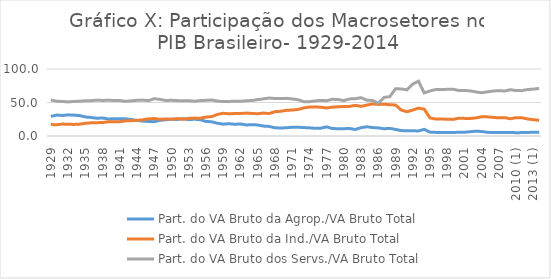
| Category | Part. do VA Bruto da Agrop./VA Bruto Total | Part. do VA Bruto da Ind./VA Bruto Total | Part. do VA Bruto dos Servs./VA Bruto Total |
|---|---|---|---|
| 1929 | 29.22 | 17.047 | 53.733 |
| 1930 | 31.262 | 16.815 | 51.923 |
| 1931 | 30.63 | 17.793 | 51.577 |
| 1932 | 31.58 | 17.549 | 50.87 |
| 1933 | 31.142 | 17.26 | 51.598 |
| 1934 | 30.456 | 17.658 | 51.886 |
| 1935 | 28.443 | 18.926 | 52.631 |
| 1936 | 27.598 | 19.655 | 52.747 |
| 1937 | 26.538 | 19.902 | 53.56 |
| 1938 | 26.868 | 20.052 | 53.08 |
| 1939 | 25.394 | 21.202 | 53.403 |
| 1940 | 25.71 | 21.269 | 53.021 |
| 1941 | 25.73 | 21.306 | 52.963 |
| 1942 | 25.683 | 22.557 | 51.76 |
| 1943 | 24.625 | 22.878 | 52.496 |
| 1944 | 23.309 | 23.41 | 53.281 |
| 1945 | 22.279 | 24.138 | 53.583 |
| 1946 | 21.601 | 25.584 | 52.815 |
| 1947 | 21.4 | 26 | 55.7 |
| 1948 | 23.4 | 24.9 | 54.6 |
| 1949 | 24.2 | 25.4 | 53 |
| 1950 | 25.1 | 25 | 53.3 |
| 1951 | 24.6 | 26 | 52.8 |
| 1952 | 25.8 | 25 | 52.5 |
| 1953 | 24.4 | 26.3 | 52.8 |
| 1954 | 25 | 26.7 | 51.9 |
| 1955 | 24.3 | 26.6 | 52.8 |
| 1956 | 21.8 | 28.2 | 53.3 |
| 1957 | 21.2 | 28.9 | 53.7 |
| 1958 | 19 | 32.2 | 52.2 |
| 1959 | 17.7 | 33.9 | 51.3 |
| 1960 | 18.3 | 33.2 | 51.5 |
| 1961 | 17.5 | 33.5 | 52 |
| 1962 | 18 | 33.6 | 51.7 |
| 1963 | 16.5 | 34.2 | 52.6 |
| 1964 | 16.9 | 33.7 | 53 |
| 1965 | 16.5 | 33.2 | 54.3 |
| 1966 | 14.8 | 34.2 | 55.4 |
| 1967 | 14.3 | 33.5 | 56.7 |
| 1968 | 12.3 | 36.3 | 55.9 |
| 1969 | 11.9 | 36.9 | 55.8 |
| 1970 | 12.3 | 38.3 | 56.2 |
| 1971 | 13 | 38.8 | 55.3 |
| 1972 | 13.1 | 39.5 | 54.2 |
| 1973 | 12.6 | 41.9 | 51.3 |
| 1974 | 12.2 | 43.2 | 51.2 |
| 1975 | 11.5 | 43.3 | 52.4 |
| 1976 | 11.7 | 43 | 53.1 |
| 1977 | 13.6 | 41.8 | 52.7 |
| 1978 | 11.2 | 43.1 | 54.8 |
| 1979 | 10.8 | 43.6 | 54.4 |
| 1980 | 10.9 | 44 | 52.8 |
| 1981 | 11.2 | 44.2 | 55.3 |
| 1982 | 9.7 | 45.7 | 55.7 |
| 1983 | 12.4 | 44.3 | 57.2 |
| 1984 | 13.8 | 46.1 | 53.5 |
| 1985 | 12.6 | 47.9 | 53 |
| 1986 | 12.1 | 47.1 | 48.8 |
| 1987 | 10.8 | 47.5 | 57.6 |
| 1988 | 11.4 | 46.7 | 58.7 |
| 1989 | 9.8 | 46.3 | 70.4 |
| 1990 | 8.1 | 38.7 | 70.3 |
| 1991 | 7.8 | 36.2 | 68.9 |
| 1992 | 7.7 | 38.7 | 77.5 |
| 1993 | 7.6 | 41.6 | 81.8 |
| 1994 | 9.9 | 40 | 64.3 |
| 1995 | 5.8 | 27 | 67.3 |
| 1996 | 5.4 | 25.3 | 69.3 |
| 1997 | 5.3 | 25.4 | 69.2 |
| 1998 | 5.4 | 24.9 | 69.7 |
| 1999 | 5.3 | 24.8 | 69.8 |
| 2000 | 5.5 | 26.5 | 68 |
| 2001 | 5.6 | 26.3 | 68 |
| 2002 | 6.4 | 26.2 | 67.3 |
| 2003 | 7.2 | 27 | 65.8 |
| 2004 | 6.7 | 28.7 | 64.6 |
| 2005 | 5.5 | 28.6 | 65.9 |
| 2006 | 5.1 | 27.8 | 67.1 |
| 2007 | 5.2 | 27.1 | 67.7 |
| 2008 | 5.4 | 27.4 | 67.2 |
| 2009 | 5.3 | 25.7 | 69.1 |
| 2010 (1) | 4.9 | 27.4 | 67.8 |
| 2011 (1) | 5.1 | 27.2 | 67.7 |
| 2012 (1) | 5.3 | 25.4 | 69.4 |
| 2013 (1) | 5.6 | 24.4 | 70 |
| 2014 (1) | 5.6 | 23.4 | 71 |